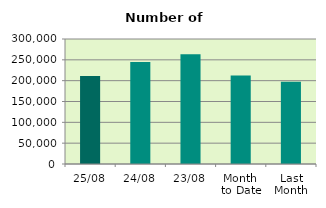
| Category | Series 0 |
|---|---|
| 25/08 | 210946 |
| 24/08 | 244686 |
| 23/08 | 263614 |
| Month 
to Date | 212209.053 |
| Last
Month | 197154 |